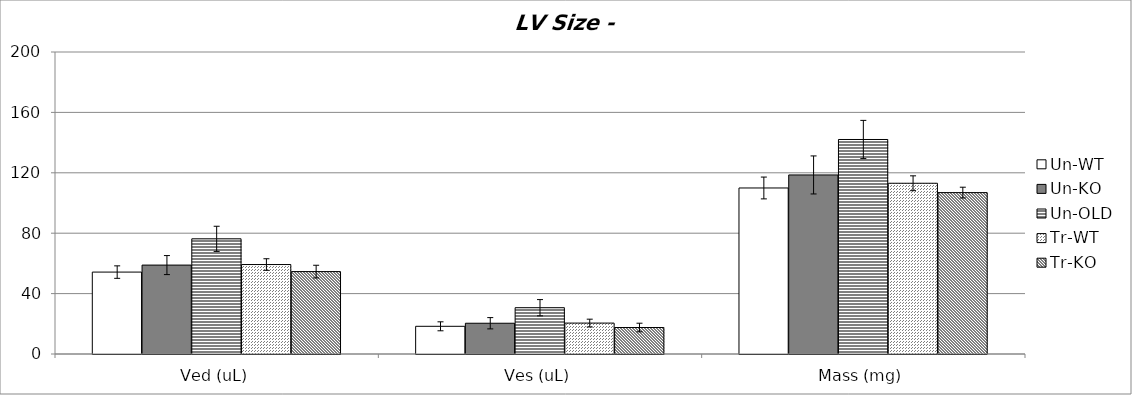
| Category | Un-WT | Un-KO | Un-OLD | Tr-WT | Tr-KO |
|---|---|---|---|---|---|
| 0 | 54.243 | 58.882 | 76.267 | 59.248 | 54.577 |
| 1 | 18.342 | 20.37 | 30.652 | 20.478 | 17.546 |
| 2 | 109.948 | 118.58 | 142.06 | 113.076 | 106.888 |